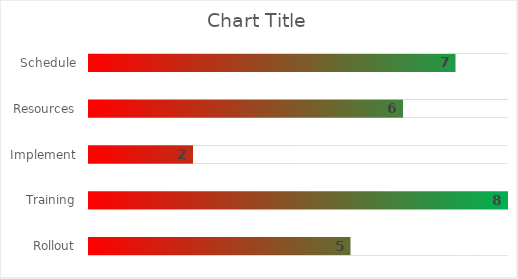
| Category | Spectrum |
|---|---|
| Schedule | 8 |
| Resources | 8 |
| Implement | 8 |
| Training | 8 |
| Rollout | 8 |